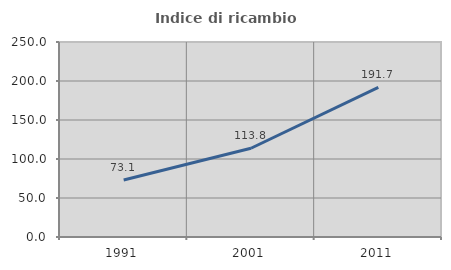
| Category | Indice di ricambio occupazionale  |
|---|---|
| 1991.0 | 73.118 |
| 2001.0 | 113.804 |
| 2011.0 | 191.749 |